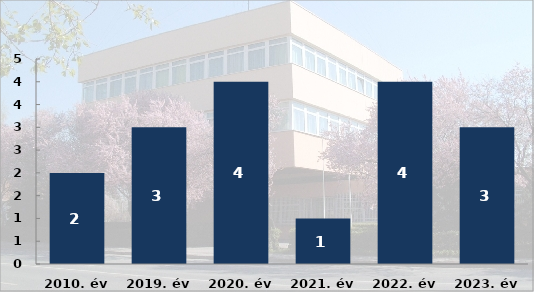
| Category | Súlyos sérüléses közúti közlekedési balesetek száma |
|---|---|
| 2010. év | 2 |
| 2019. év | 3 |
| 2020. év | 4 |
| 2021. év | 1 |
| 2022. év | 4 |
| 2023. év | 3 |